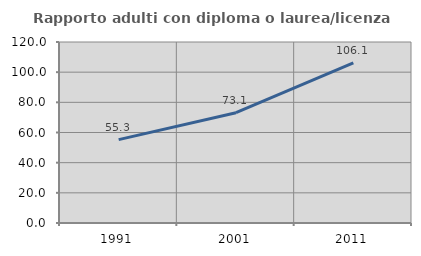
| Category | Rapporto adulti con diploma o laurea/licenza media  |
|---|---|
| 1991.0 | 55.294 |
| 2001.0 | 73.134 |
| 2011.0 | 106.127 |